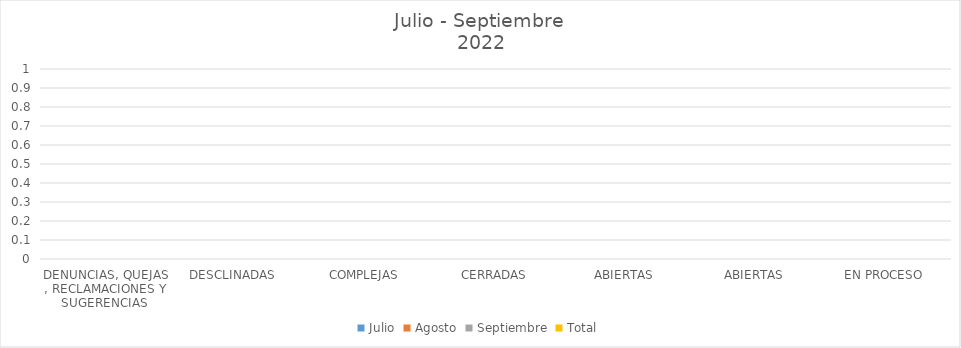
| Category | Julio | Agosto | Septiembre | Total |
|---|---|---|---|---|
| DENUNCIAS, QUEJAS , RECLAMACIONES Y SUGERENCIAS  | 0 | 0 | 0 | 0 |
| DESCLINADAS  | 0 | 0 | 0 | 0 |
| COMPLEJAS | 0 | 0 | 0 | 0 |
| CERRADAS | 0 | 0 | 0 | 0 |
| ABIERTAS | 0 | 0 | 0 | 0 |
| ABIERTAS | 0 | 0 | 0 | 0 |
| EN PROCESO | 0 | 0 | 0 | 0 |